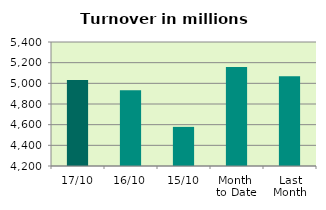
| Category | Series 0 |
|---|---|
| 17/10 | 5032.407 |
| 16/10 | 4932.757 |
| 15/10 | 4578.604 |
| Month 
to Date | 5158.105 |
| Last
Month | 5068.328 |